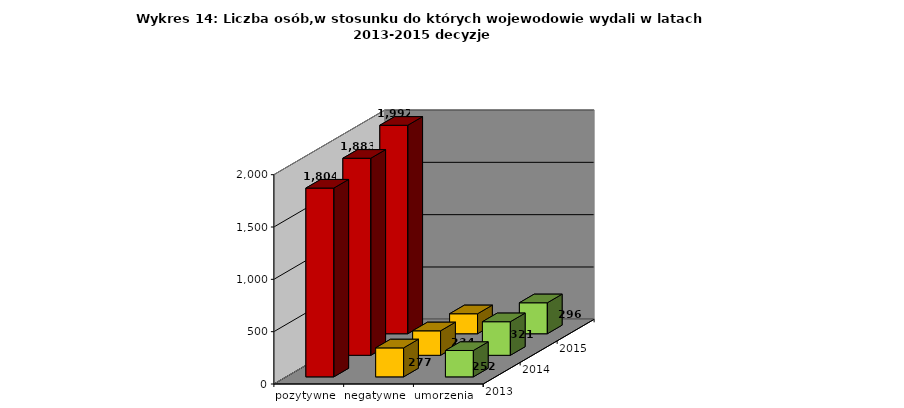
| Category | pozytywne | negatywne | umorzenia |
|---|---|---|---|
| 2013.0 | 1804 | 277 | 252 |
| 2014.0 | 1883 | 234 | 321 |
| 2015.0 | 1992 | 191 | 296 |